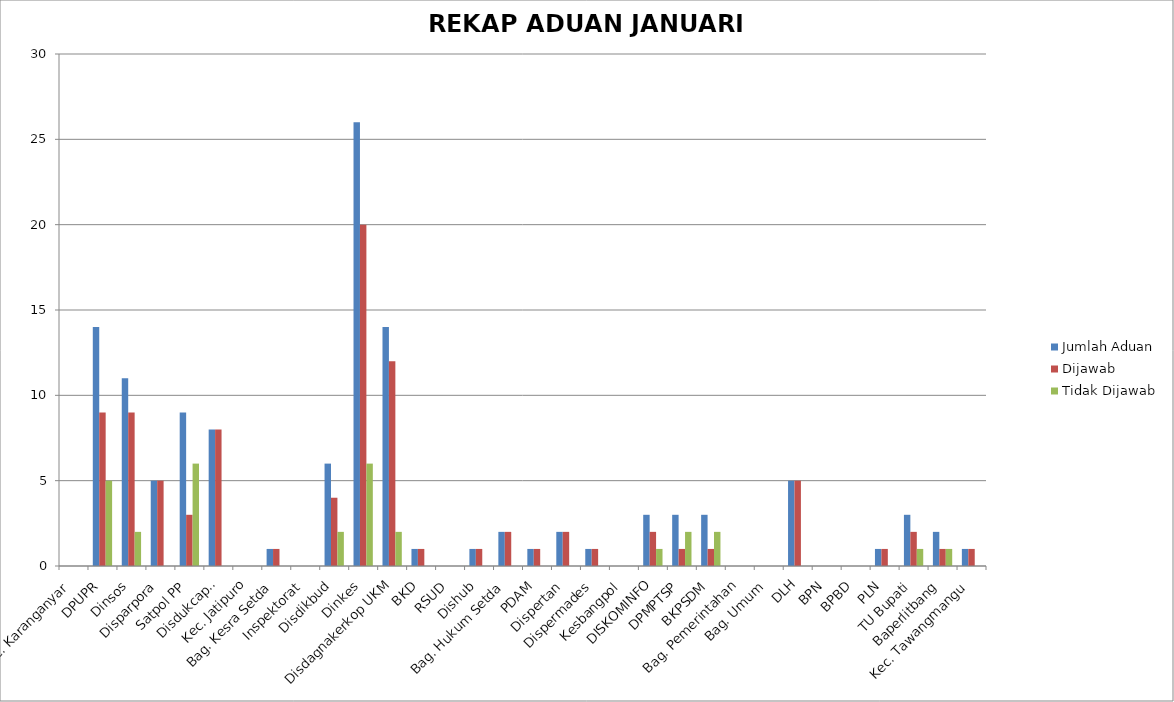
| Category | Jumlah Aduan | Dijawab | Tidak Dijawab |
|---|---|---|---|
| Kec. Karanganyar | 0 | 0 | 0 |
| DPUPR | 14 | 9 | 5 |
| Dinsos | 11 | 9 | 2 |
| Disparpora | 5 | 5 | 0 |
| Satpol PP | 9 | 3 | 6 |
| Disdukcapil | 8 | 8 | 0 |
| Kec. Jatipuro | 0 | 0 | 0 |
| Bag. Kesra Setda | 1 | 1 | 0 |
| Inspektorat | 0 | 0 | 0 |
| Disdikbud | 6 | 4 | 2 |
| Dinkes | 26 | 20 | 6 |
| Disdagnakerkop UKM | 14 | 12 | 2 |
| BKD | 1 | 1 | 0 |
| RSUD | 0 | 0 | 0 |
| Dishub | 1 | 1 | 0 |
| Bag. Hukum Setda | 2 | 2 | 0 |
| PDAM | 1 | 1 | 0 |
| Dispertan | 2 | 2 | 0 |
| Dispermades | 1 | 1 | 0 |
| Kesbangpol | 0 | 0 | 0 |
| DISKOMINFO | 3 | 2 | 1 |
| DPMPTSP | 3 | 1 | 2 |
| BKPSDM | 3 | 1 | 2 |
| Bag. Pemerintahan | 0 | 0 | 0 |
| Bag. Umum | 0 | 0 | 0 |
| DLH | 5 | 5 | 0 |
| BPN | 0 | 0 | 0 |
| BPBD | 0 | 0 | 0 |
| PLN | 1 | 1 | 0 |
| TU Bupati | 3 | 2 | 1 |
| Baperlitbang | 2 | 1 | 1 |
| Kec. Tawangmangu | 1 | 1 | 0 |